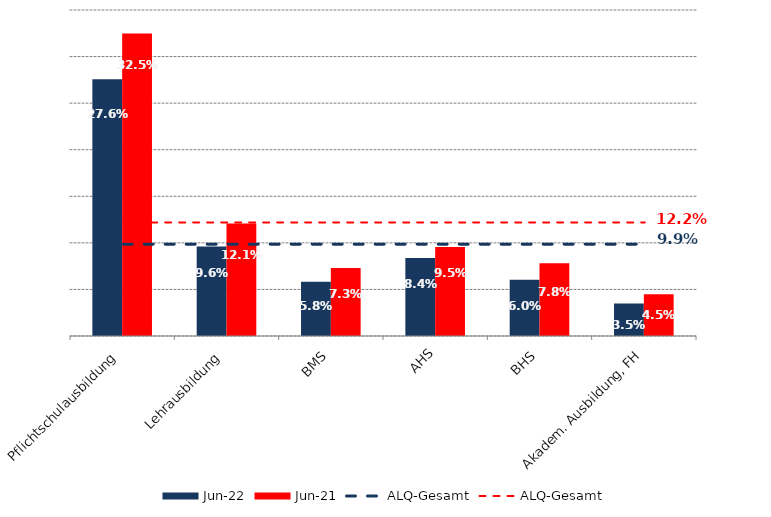
| Category | Jun 22 | Jun 21 |
|---|---|---|
| Pflichtschulausbildung | 0.276 | 0.325 |
| Lehrausbildung | 0.096 | 0.121 |
| BMS | 0.058 | 0.073 |
| AHS | 0.084 | 0.095 |
| BHS | 0.06 | 0.078 |
| Akadem. Ausbildung, FH | 0.035 | 0.045 |